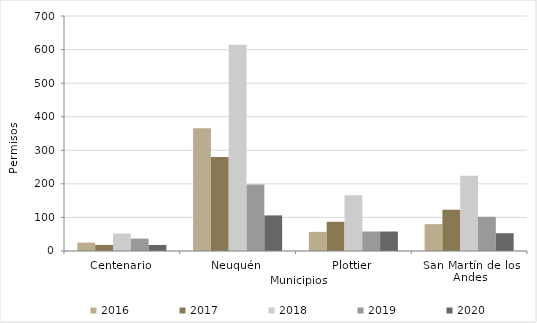
| Category | 2016 | 2017 | 2018 | 2019 | 2020 |
|---|---|---|---|---|---|
| Centenario | 25 | 18 | 52 | 37 | 18 |
| Neuquén | 366 | 280 | 614 | 198 | 106 |
| Plottier | 57 | 87 | 166 | 58 | 58 |
| San Martín de los Andes | 80 | 123 | 224 | 102 | 53 |